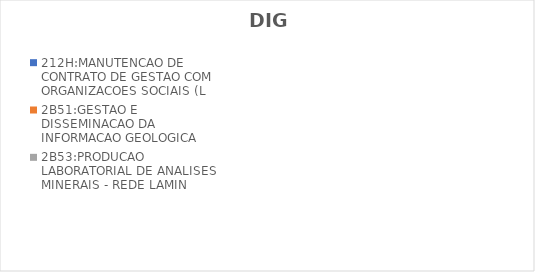
| Category | 212H:MANUTENCAO DE CONTRATO DE GESTAO COM ORGANIZACOES SOCIAIS (L | 2B51:GESTAO E DISSEMINACAO DA INFORMACAO GEOLOGICA | 2B53:PRODUCAO LABORATORIAL DE ANALISES MINERAIS - REDE LAMIN |
|---|---|---|---|
| EXECUTADO | 0 | 0.718 | 0.347 |